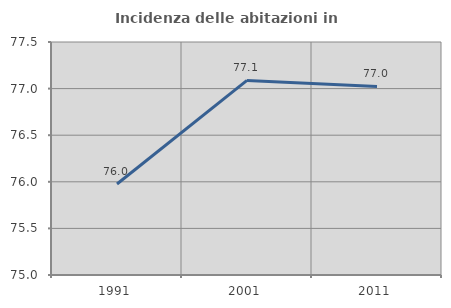
| Category | Incidenza delle abitazioni in proprietà  |
|---|---|
| 1991.0 | 75.976 |
| 2001.0 | 77.088 |
| 2011.0 | 77.023 |